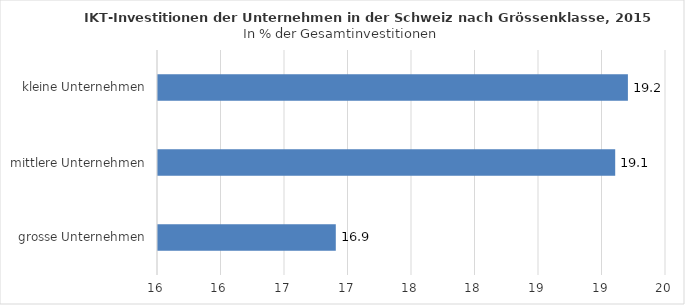
| Category | Anteil der IKT-Investitionen an den Gesamtinvestitionen (in %) |
|---|---|
| grosse Unternehmen | 16.9 |
| mittlere Unternehmen | 19.1 |
| kleine Unternehmen | 19.2 |